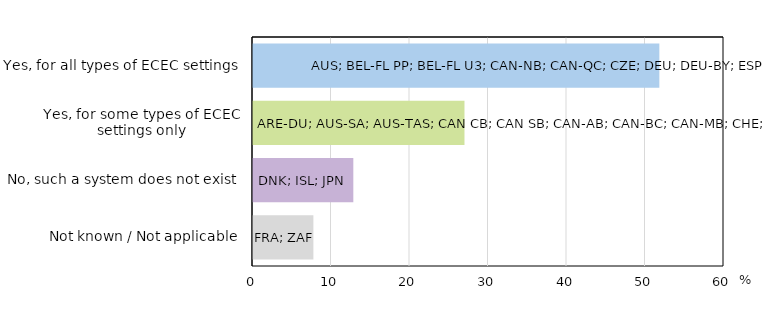
| Category | Series 0 |
|---|---|
| Yes, for all types of ECEC settings | 51.763 |
| Yes, for some types of ECEC settings only | 26.939 |
| No, such a system does not exist | 12.779 |
| Not known / Not applicable | 7.692 |